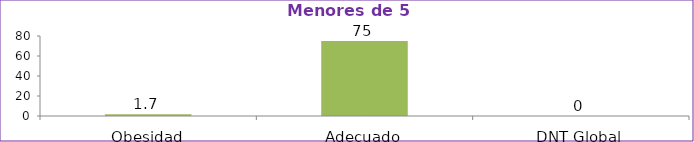
| Category | Series 0 |
|---|---|
| Obesidad | 1.7 |
| Adecuado | 75 |
| DNT Global | 0 |